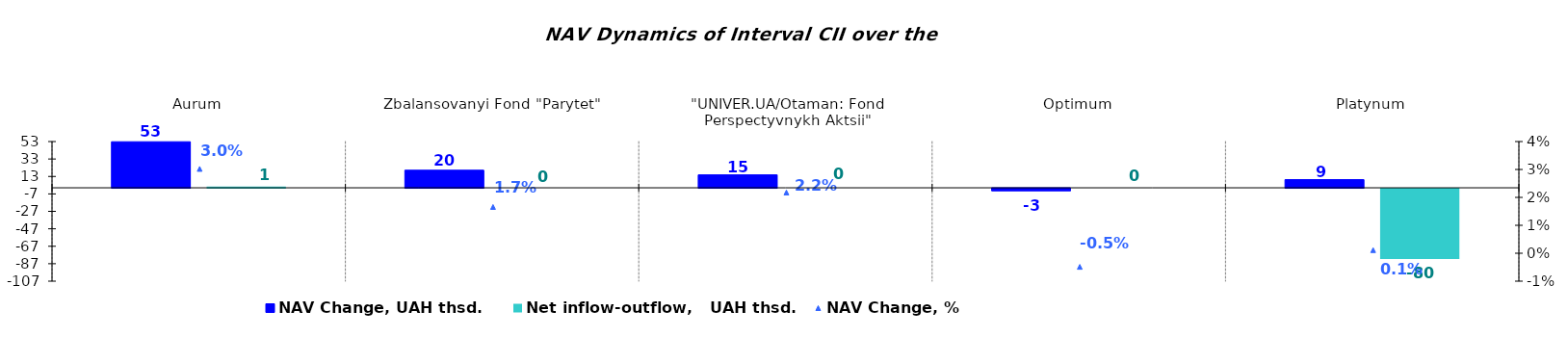
| Category | NAV Change, UAH thsd. | Net inflow-outflow,   UAH thsd. |
|---|---|---|
| Аurum | 52.766 | 1.288 |
| Zbalansovanyi Fond "Parytet" | 20.141 | 0 |
| "UNIVER.UA/Otaman: Fond Perspectyvnykh Aktsii" | 14.794 | 0 |
| Optimum | -2.833 | 0 |
| Platynum | 9.356 | -80.458 |